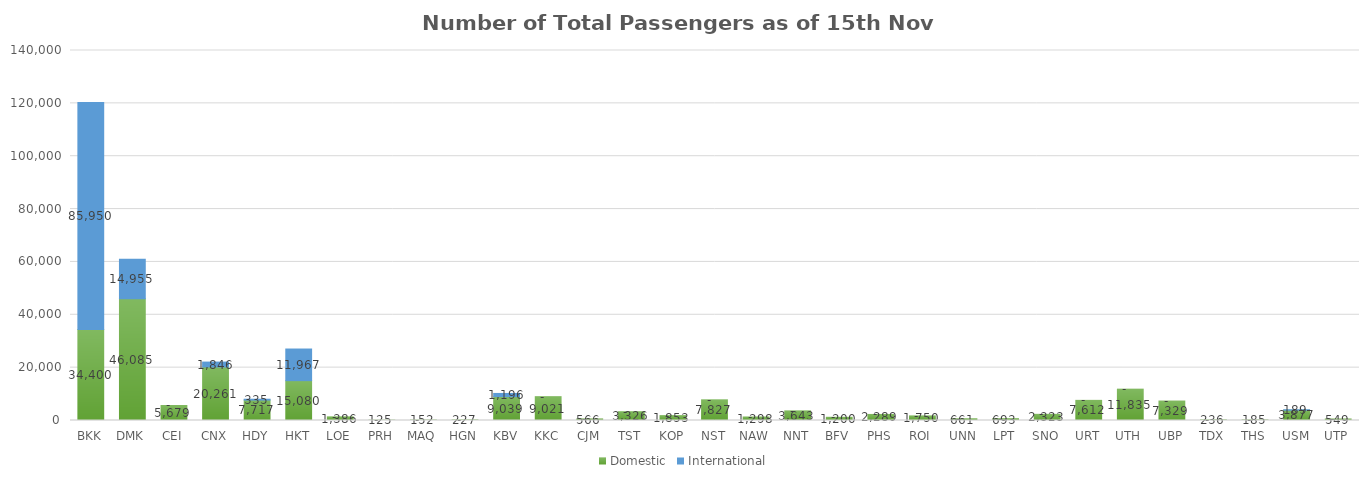
| Category | Domestic | International |
|---|---|---|
| BKK | 34400 | 85950 |
| DMK | 46085 | 14955 |
| CEI | 5679 | 0 |
| CNX | 20261 | 1846 |
| HDY | 7717 | 335 |
| HKT | 15080 | 11967 |
| LOE | 1386 | 0 |
| PRH | 125 | 0 |
| MAQ | 152 | 0 |
| HGN | 227 | 0 |
| KBV | 9039 | 1196 |
| KKC | 9021 | 0 |
| CJM | 566 | 0 |
| TST | 3326 | 0 |
| KOP | 1853 | 0 |
| NST | 7827 | 0 |
| NAW | 1298 | 0 |
| NNT | 3643 | 0 |
| BFV | 1200 | 0 |
| PHS | 2289 | 0 |
| ROI | 1750 | 0 |
| UNN | 661 | 0 |
| LPT | 693 | 0 |
| SNO | 2323 | 0 |
| URT | 7612 | 0 |
| UTH | 11835 | 0 |
| UBP | 7329 | 0 |
| TDX | 236 | 0 |
| THS | 185 | 0 |
| USM | 3877 | 189 |
| UTP | 549 | 0 |